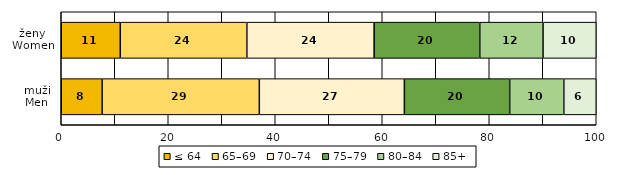
| Category | ≤ 64 | 65–69 | 70–74 | 75–79 | 80–84 | 85+ |
|---|---|---|---|---|---|---|
| muži
Men | 7.642 | 29.385 | 27.106 | 19.687 | 10.121 | 6.058 |
| ženy
Women | 11.033 | 23.663 | 23.789 | 19.749 | 11.823 | 9.944 |